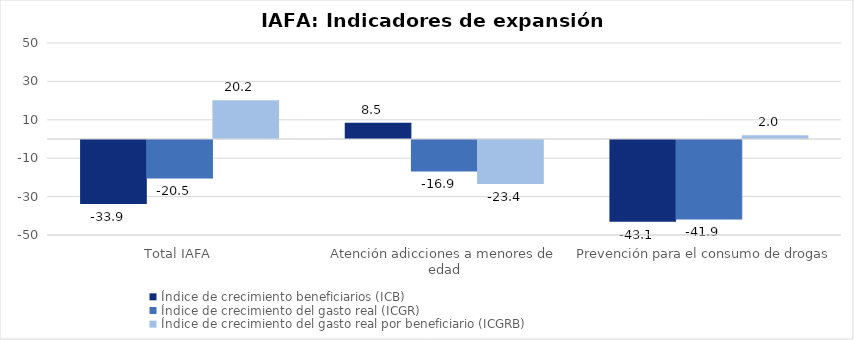
| Category | Índice de crecimiento beneficiarios (ICB)  | Índice de crecimiento del gasto real (ICGR)  | Índice de crecimiento del gasto real por beneficiario (ICGRB)  |
|---|---|---|---|
| Total IAFA | -33.865 | -20.524 | 20.173 |
| Atención adicciones a menores de edad | 8.486 | -16.926 | -23.424 |
| Prevención para el consumo de drogas | -43.056 | -41.907 | 2.018 |